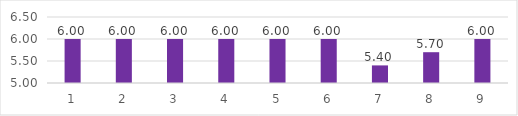
| Category | Series 0 |
|---|---|
| 0 | 6 |
| 1 | 6 |
| 2 | 6 |
| 3 | 6 |
| 4 | 6 |
| 5 | 6 |
| 6 | 5.4 |
| 7 | 5.7 |
| 8 | 6 |